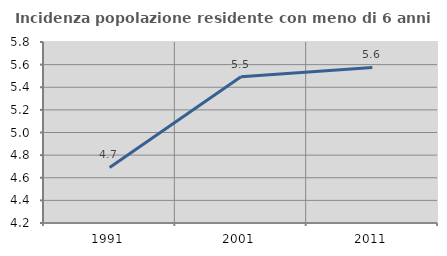
| Category | Incidenza popolazione residente con meno di 6 anni |
|---|---|
| 1991.0 | 4.691 |
| 2001.0 | 5.493 |
| 2011.0 | 5.575 |